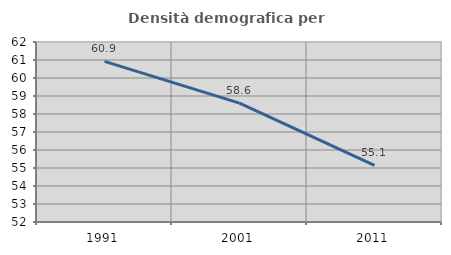
| Category | Densità demografica |
|---|---|
| 1991.0 | 60.927 |
| 2001.0 | 58.607 |
| 2011.0 | 55.145 |